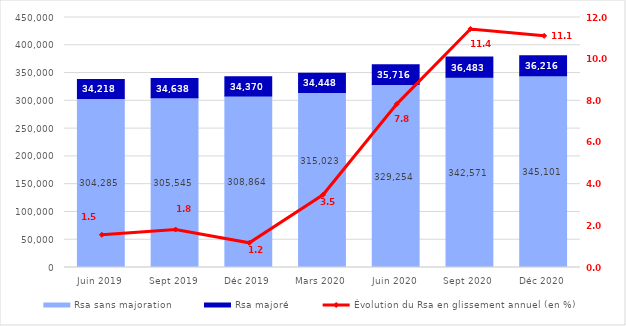
| Category | Rsa sans majoration | Rsa majoré |
|---|---|---|
| Juin 2019 | 304285 | 34218 |
| Sept 2019 | 305545 | 34638 |
| Déc 2019 | 308864 | 34370 |
| Mars 2020 | 315023 | 34448 |
| Juin 2020 | 329254 | 35716 |
| Sept 2020 | 342571 | 36483 |
| Déc 2020 | 345101 | 36216 |